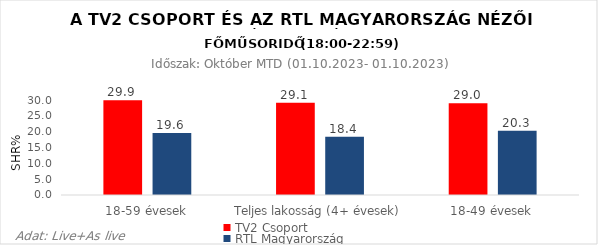
| Category | TV2 Csoport | RTL Magyarország |
|---|---|---|
| 18-59 évesek | 29.9 | 19.6 |
| Teljes lakosság (4+ évesek) | 29.1 | 18.4 |
| 18-49 évesek | 29 | 20.3 |